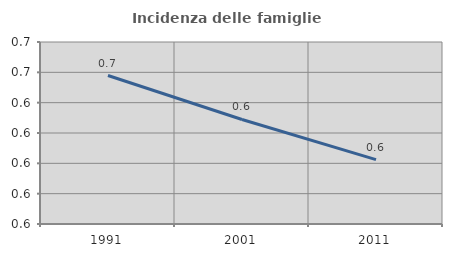
| Category | Incidenza delle famiglie numerose |
|---|---|
| 1991.0 | 0.658 |
| 2001.0 | 0.629 |
| 2011.0 | 0.602 |